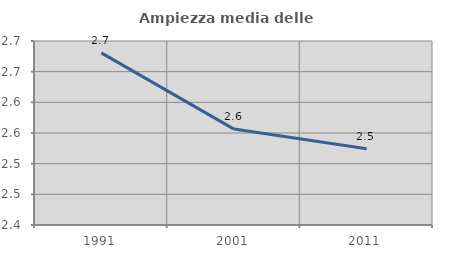
| Category | Ampiezza media delle famiglie |
|---|---|
| 1991.0 | 2.681 |
| 2001.0 | 2.556 |
| 2011.0 | 2.524 |